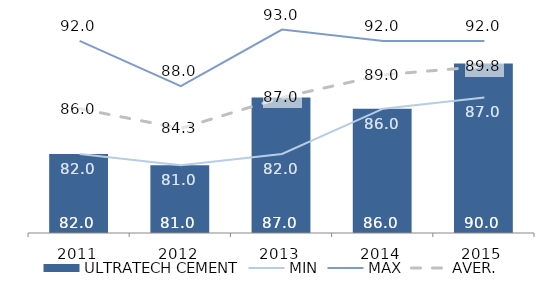
| Category | ULTRATECH CEMENT |
|---|---|
| 2011 | 82 |
| 2012 | 81 |
| 2013 | 87 |
| 2014 | 86 |
| 2015 | 90 |